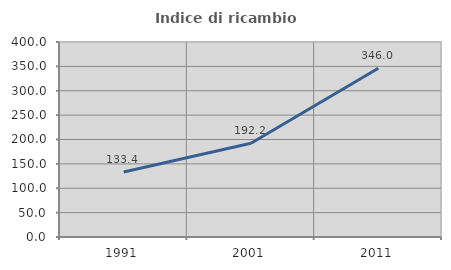
| Category | Indice di ricambio occupazionale  |
|---|---|
| 1991.0 | 133.372 |
| 2001.0 | 192.167 |
| 2011.0 | 346.035 |